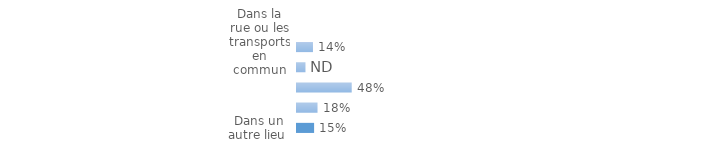
| Category | Series 0 |
|---|---|
| Dans la rue ou les transports en commun | 0.14 |
| Sur le lieu de travail ou d'études  | 0.074 |
| Au domicile ou dans l'immeuble de la victime | 0.48 |
| Au domicile d'une autre personne | 0.18 |
| Dans un autre lieu  | 0.15 |